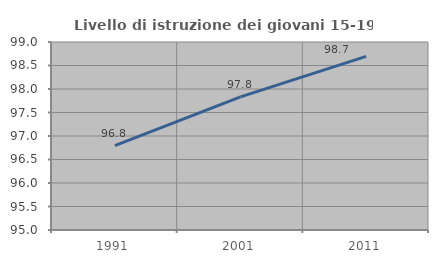
| Category | Livello di istruzione dei giovani 15-19 anni |
|---|---|
| 1991.0 | 96.796 |
| 2001.0 | 97.833 |
| 2011.0 | 98.693 |